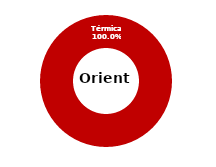
| Category | Oriente |
|---|---|
| Eólica | 0 |
| Hidráulica | 0 |
| Solar | 0 |
| Térmica | 41.929 |